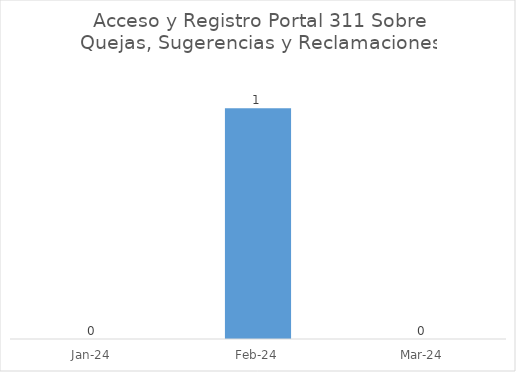
| Category | Cantidad |
|---|---|
| 2024-01-01 | 0 |
| 2024-02-01 | 1 |
| 2024-03-01 | 0 |